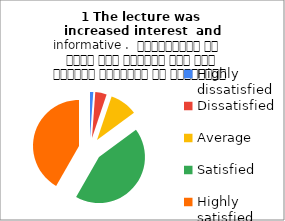
| Category | 1 The lecture was  increased interest  and informative .  व्याख्यान से रुचि में वृद्धि हुई एवं शिक्षण जानकारी से परिपूर्ण था |
|---|---|
| Highly dissatisfied | 2 |
| Dissatisfied | 7 |
| Average | 17 |
| Satisfied | 76 |
| Highly satisfied | 73 |